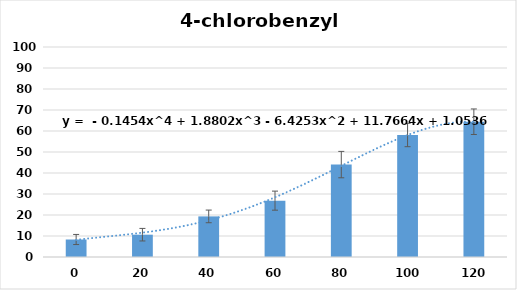
| Category | Series 0 |
|---|---|
| 0.0 | 8.333 |
| 20.0 | 10.625 |
| 40.0 | 19.333 |
| 60.0 | 26.833 |
| 80.0 | 44 |
| 100.0 | 58.083 |
| 120.0 | 64.417 |